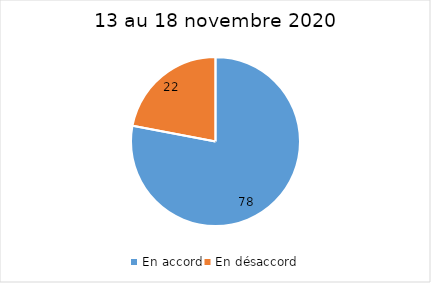
| Category | Series 0 |
|---|---|
| En accord | 78 |
| En désaccord | 22 |